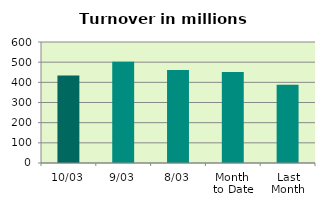
| Category | Series 0 |
|---|---|
| 10/03 | 433.94 |
| 9/03 | 501.616 |
| 8/03 | 460.696 |
| Month 
to Date | 450.66 |
| Last
Month | 387.65 |